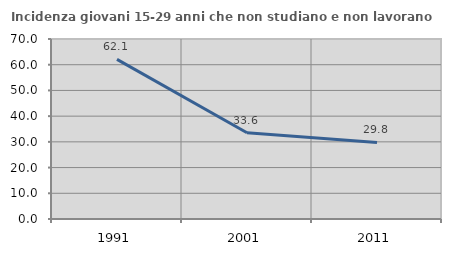
| Category | Incidenza giovani 15-29 anni che non studiano e non lavorano  |
|---|---|
| 1991.0 | 62.066 |
| 2001.0 | 33.566 |
| 2011.0 | 29.794 |